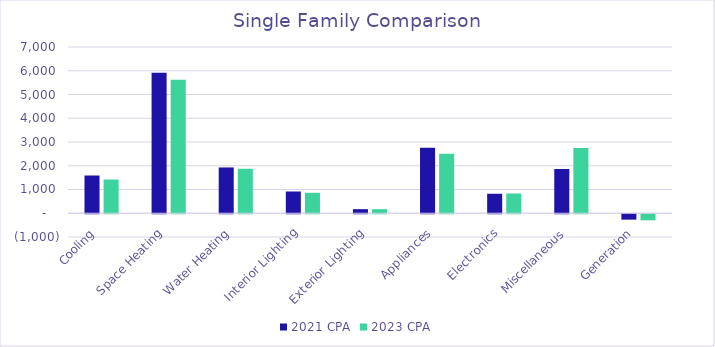
| Category | 2021 CPA | 2023 CPA |
|---|---|---|
|  Cooling  | 1589.955 | 1421.225 |
|  Space Heating  | 5919.839 | 5624.071 |
|  Water Heating  | 1928.688 | 1872.582 |
|  Interior Lighting  | 916.515 | 860.966 |
|  Exterior Lighting  | 172.18 | 171.882 |
|  Appliances  | 2760.137 | 2503.587 |
|  Electronics  | 820.499 | 831.583 |
|  Miscellaneous  | 1863.696 | 2749.475 |
|  Generation  | -227.334 | -255.384 |